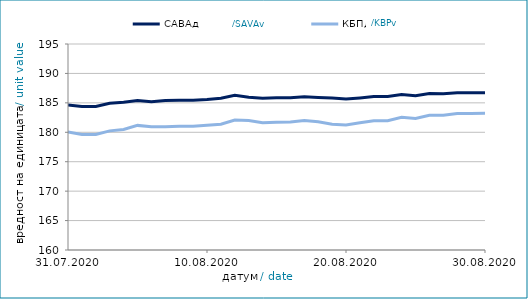
| Category | САВАд | КБПд |
|---|---|---|
| 2020-07-31 | 184.657 | 180.055 |
| 2020-08-01 | 184.383 | 179.633 |
| 2020-08-02 | 184.388 | 179.639 |
| 2020-08-03 | 184.946 | 180.24 |
| 2020-08-04 | 185.12 | 180.483 |
| 2020-08-05 | 185.417 | 181.172 |
| 2020-08-06 | 185.189 | 180.938 |
| 2020-08-07 | 185.39 | 180.923 |
| 2020-08-08 | 185.456 | 181.038 |
| 2020-08-09 | 185.461 | 181.045 |
| 2020-08-10 | 185.56 | 181.214 |
| 2020-08-11 | 185.793 | 181.375 |
| 2020-08-12 | 186.292 | 182.088 |
| 2020-08-13 | 185.939 | 181.993 |
| 2020-08-14 | 185.804 | 181.633 |
| 2020-08-15 | 185.867 | 181.724 |
| 2020-08-16 | 185.872 | 181.731 |
| 2020-08-17 | 186.028 | 181.982 |
| 2020-08-18 | 185.924 | 181.798 |
| 2020-08-19 | 185.839 | 181.37 |
| 2020-08-20 | 185.658 | 181.245 |
| 2020-08-21 | 185.844 | 181.605 |
| 2020-08-22 | 186.073 | 181.952 |
| 2020-08-23 | 186.077 | 181.959 |
| 2020-08-24 | 186.411 | 182.553 |
| 2020-08-25 | 186.193 | 182.334 |
| 2020-08-26 | 186.602 | 182.877 |
| 2020-08-27 | 186.56 | 182.907 |
| 2020-08-28 | 186.722 | 183.201 |
| 2020-08-29 | 186.727 | 183.208 |
| 2020-08-30 | 186.731 | 183.215 |